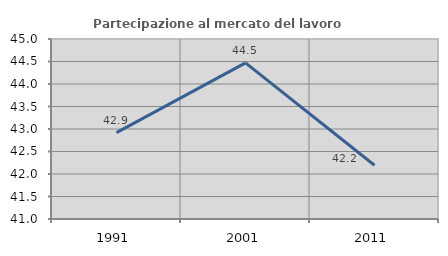
| Category | Partecipazione al mercato del lavoro  femminile |
|---|---|
| 1991.0 | 42.918 |
| 2001.0 | 44.469 |
| 2011.0 | 42.194 |